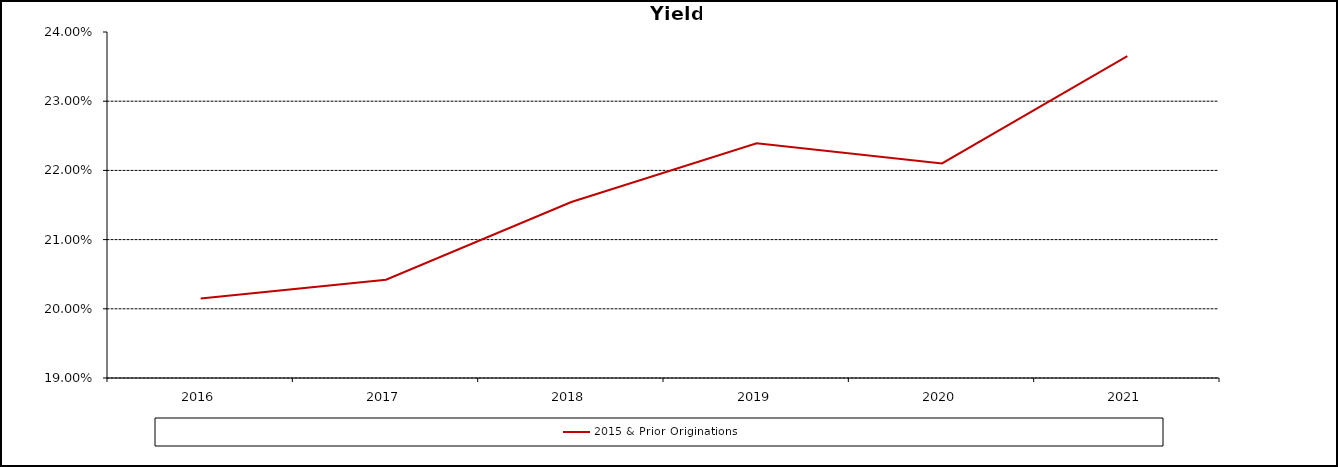
| Category | 2015 & Prior Originations |
|---|---|
| 2016.0 | 0.202 |
| 2017.0 | 0.204 |
| 2018.0 | 0.215 |
| 2019.0 | 0.224 |
| 2020.0 | 0.221 |
| 2021.0 | 0.236 |